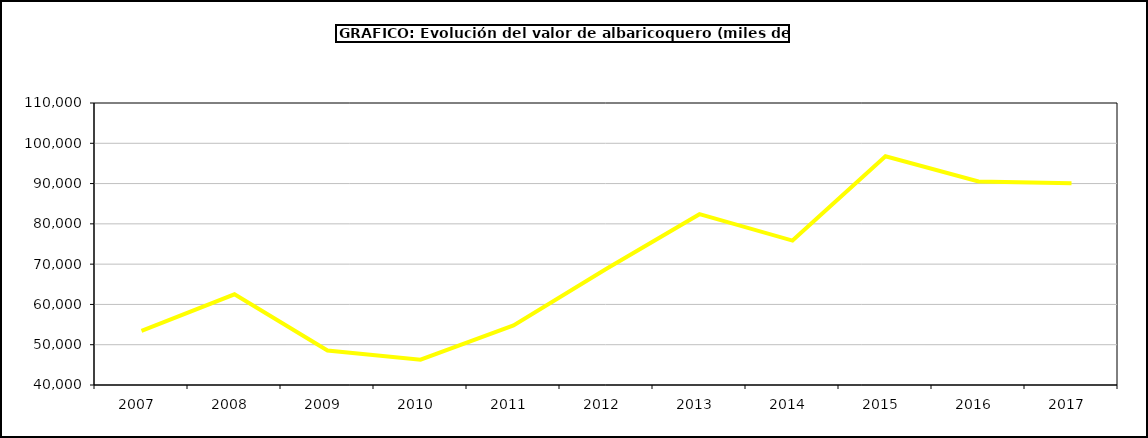
| Category | valor albaricoquero |
|---|---|
| 2007.0 | 53431.605 |
| 2008.0 | 62518.884 |
| 2009.0 | 48553.188 |
| 2010.0 | 46289.905 |
| 2011.0 | 54777.84 |
| 2012.0 | 68866.776 |
| 2013.0 | 82399.533 |
| 2014.0 | 75850.331 |
| 2015.0 | 96779 |
| 2016.0 | 90534 |
| 2017.0 | 90084.503 |